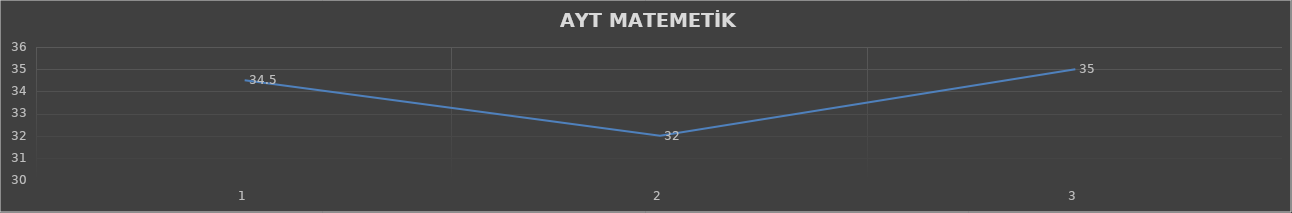
| Category | Series 0 |
|---|---|
| 0 | 34.5 |
| 1 | 32 |
| 2 | 35 |